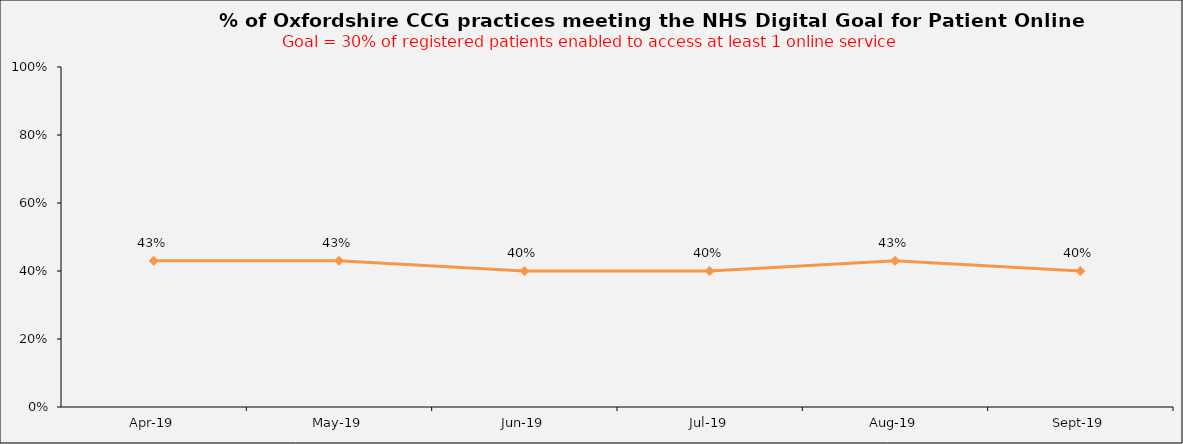
| Category | Series 0 |
|---|---|
| 2019-04-01 | 0.43 |
| 2019-05-01 | 0.43 |
| 2019-06-01 | 0.4 |
| 2019-07-01 | 0.4 |
| 2019-08-01 | 0.43 |
| 2019-09-01 | 0.4 |